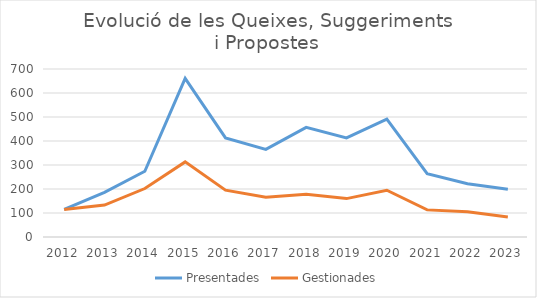
| Category | Presentades | Gestionades |
|---|---|---|
| 2012.0 | 115 | 115 |
| 2013.0 | 186 | 133 |
| 2014.0 | 274 | 202 |
| 2015.0 | 661 | 313 |
| 2016.0 | 413 | 195 |
| 2017.0 | 365 | 166 |
| 2018.0 | 457 | 178 |
| 2019.0 | 413 | 160 |
| 2020.0 | 491 | 195 |
| 2021.0 | 264 | 113 |
| 2022.0 | 222 | 105 |
| 2023.0 | 199 | 83 |